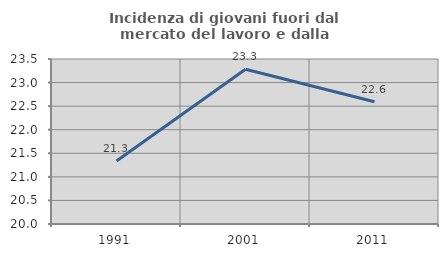
| Category | Incidenza di giovani fuori dal mercato del lavoro e dalla formazione  |
|---|---|
| 1991.0 | 21.338 |
| 2001.0 | 23.284 |
| 2011.0 | 22.593 |